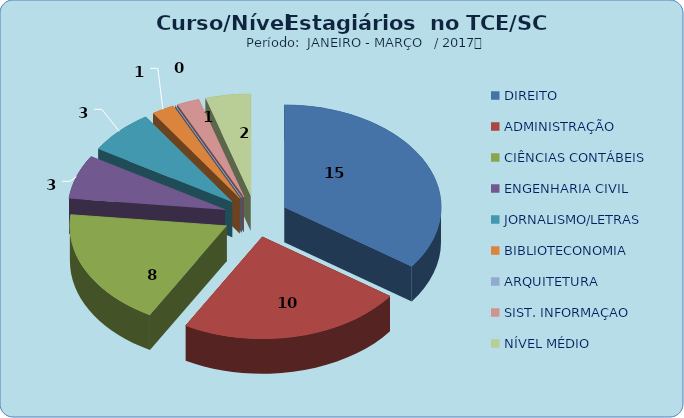
| Category | Series 0 |
|---|---|
| DIREITO | 15 |
| ADMINISTRAÇÃO | 10 |
| CIÊNCIAS CONTÁBEIS | 8 |
| ENGENHARIA CIVIL | 3 |
| JORNALISMO/LETRAS | 3 |
| BIBLIOTECONOMIA | 1 |
| ARQUITETURA | 0 |
| SIST. INFORMAÇAO | 1 |
| NÍVEL MÉDIO | 2 |